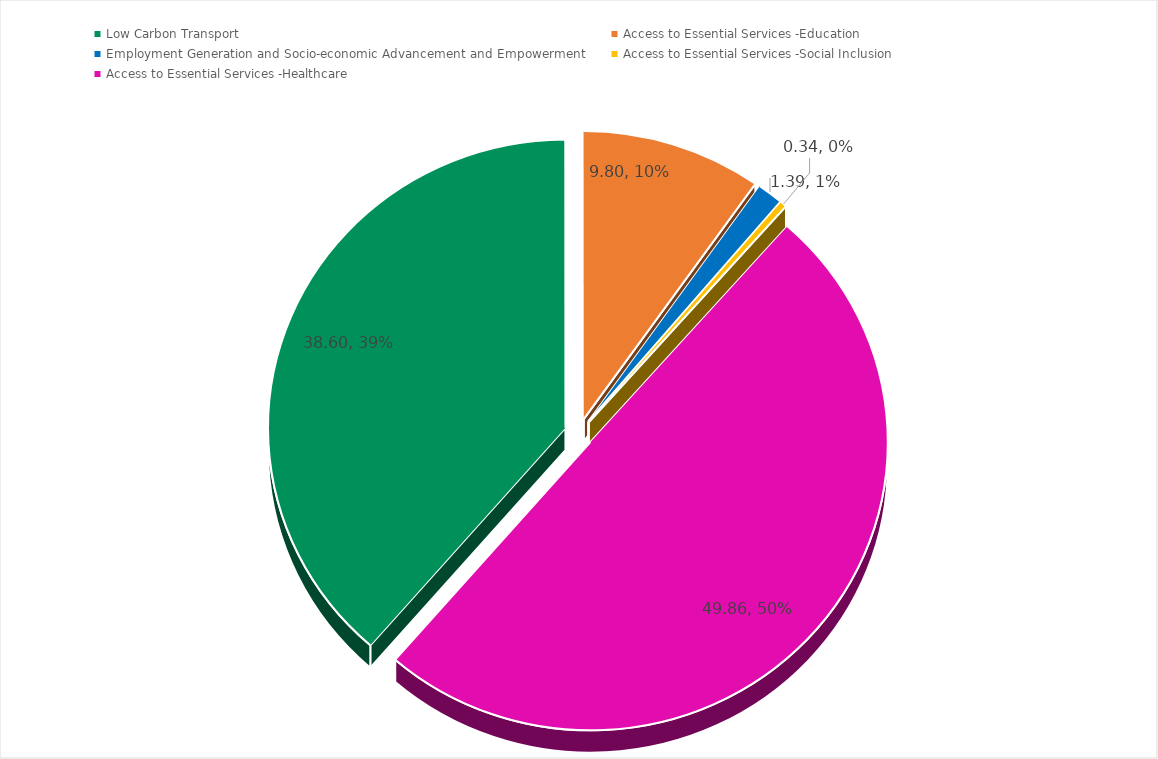
| Category | Series 0 |
|---|---|
| Low Carbon Transport | 38.603 |
| Access to Essential Services -Education | 9.796 |
| Employment Generation and Socio-economic Advancement and Empowerment  | 1.394 |
| Access to Essential Services -Social Inclusion | 0.345 |
| Access to Essential Services -Healthcare | 49.863 |